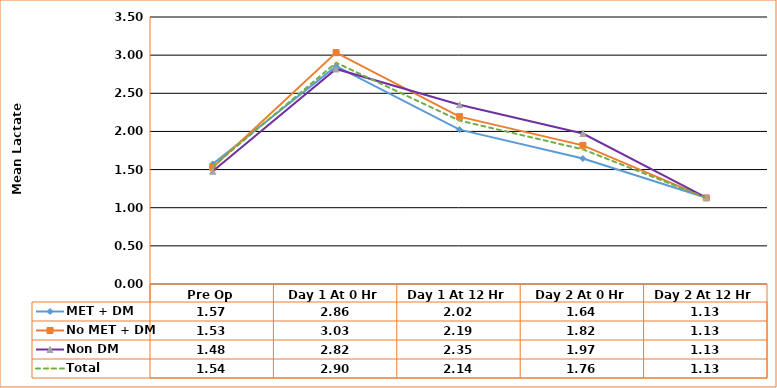
| Category | MET + DM | No MET + DM | Non DM | Total |
|---|---|---|---|---|
| Pre Op | 1.574 | 1.528 | 1.478 | 1.54 |
| Day 1 At 0 Hr | 2.855 | 3.033 | 2.819 | 2.901 |
| Day 1 At 12 Hr | 2.023 | 2.194 | 2.35 | 2.142 |
| Day 2 At 0 Hr | 1.644 | 1.818 | 1.973 | 1.765 |
| Day 2 At 12 Hr | 1.13 | 1.128 | 1.133 | 1.13 |